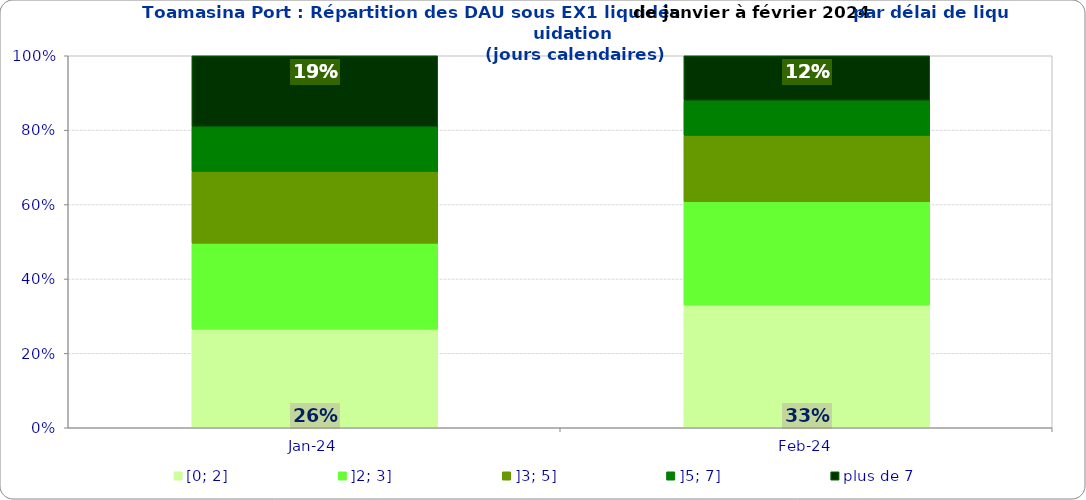
| Category | [0; 2] | ]2; 3] | ]3; 5] | ]5; 7] | plus de 7 |
|---|---|---|---|---|---|
| 2024-01-01 | 0.265 | 0.231 | 0.193 | 0.12 | 0.191 |
| 2024-02-01 | 0.33 | 0.278 | 0.178 | 0.094 | 0.12 |